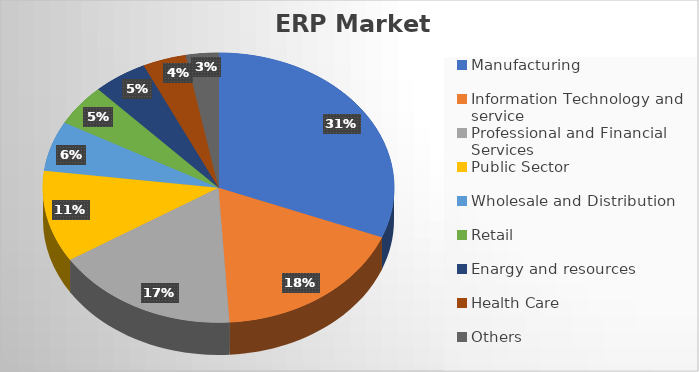
| Category | Series 0 |
|---|---|
| Manufacturing | 0.31 |
| Information Technology and service | 0.18 |
| Professional and Financial Services | 0.17 |
| Public Sector | 0.11 |
| Wholesale and Distribution | 0.06 |
| Retail | 0.05 |
| Enargy and resources | 0.05 |
| Health Care | 0.04 |
| Others | 0.03 |